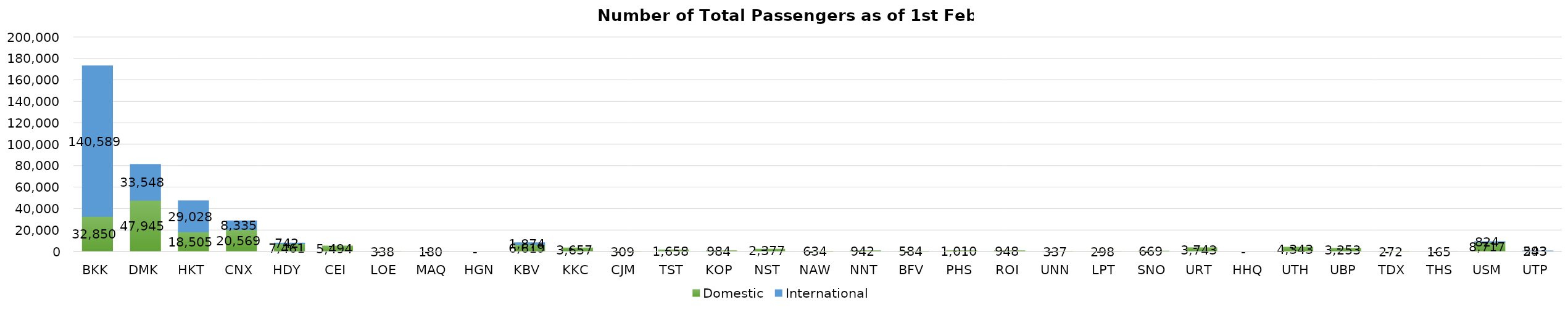
| Category | Domestic | International |
|---|---|---|
| BKK | 32850 | 140589 |
| DMK | 47945 | 33548 |
| HKT | 18505 | 29028 |
| CNX | 20569 | 8335 |
| HDY | 7461 | 742 |
| CEI | 5494 | 0 |
| LOE | 338 | 0 |
| MAQ | 180 | 0 |
| HGN | 0 | 0 |
| KBV | 6619 | 1874 |
| KKC | 3657 | 0 |
| CJM | 309 | 0 |
| TST | 1658 | 0 |
| KOP | 984 | 0 |
| NST | 2377 | 0 |
| NAW | 634 | 0 |
| NNT | 942 | 0 |
| BFV | 584 | 0 |
| PHS | 1010 | 0 |
| ROI | 948 | 0 |
| UNN | 337 | 0 |
| LPT | 298 | 0 |
| SNO | 669 | 0 |
| URT | 3743 | 0 |
| HHQ | 0 | 0 |
| UTH | 4343 | 0 |
| UBP | 3253 | 0 |
| TDX | 272 | 0 |
| THS | 165 | 0 |
| USM | 8717 | 824 |
| UTP | 593 | 243 |